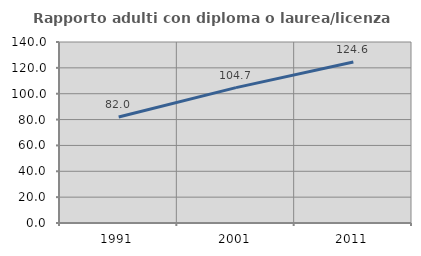
| Category | Rapporto adulti con diploma o laurea/licenza media  |
|---|---|
| 1991.0 | 81.957 |
| 2001.0 | 104.689 |
| 2011.0 | 124.597 |